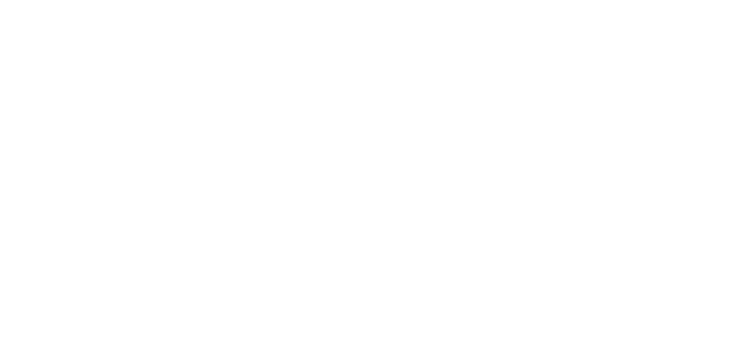
| Category | Total |
|---|---|
| David Roush | 100 |
| John Brown | 100 |
| Stephen Rappold | 100 |
| James Hawley | 100 |
| Tyler Villers | 100 |
| William Dodson | 100 |
| Ryan Riffle | 100 |
| Scotty Pauley | 100 |
| Natasha Rollins | 100 |
| John Miller | 100 |
| Donald Jordan | 100 |
| Bobby Snodgrass | 100 |
| Thomas Queen | 100 |
| Scott Felice | 100 |
| Charles Bittinger | 100 |
| Deanna Marsico | 100 |
| MICHELE CUNNINGHAM | 100 |
| Richard Perkins | 100 |
| Tom Harriston | 100 |
| Connie Graham | 100 |
| CATHLEEN SALMONS | 100 |
| Teigan Price | 100 |
| Anthony Miller | 100 |
| Valerie Felton | 100 |
| Michelle Nabers | 100 |
| Madison Goff | 100 |
| Kristina Roberts | 100 |
| Nathan Poling | 100 |
| David Skeens | 100 |
| Miranda Snyder | 100 |
| Nathaniel Flohr | 100 |